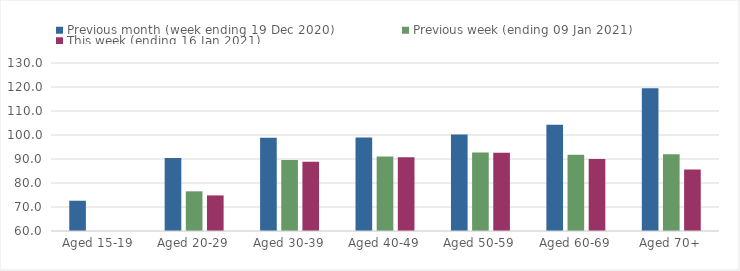
| Category | Previous month (week ending 19 Dec 2020) | Previous week (ending 09 Jan 2021) | This week (ending 16 Jan 2021) |
|---|---|---|---|
| Aged 15-19 | 72.61 | 48.84 | 49.55 |
| Aged 20-29 | 90.44 | 76.53 | 74.83 |
| Aged 30-39 | 98.86 | 89.6 | 88.84 |
| Aged 40-49 | 98.94 | 91.06 | 90.69 |
| Aged 50-59 | 100.24 | 92.66 | 92.65 |
| Aged 60-69 | 104.25 | 91.77 | 90.05 |
| Aged 70+ | 119.51 | 91.97 | 85.65 |